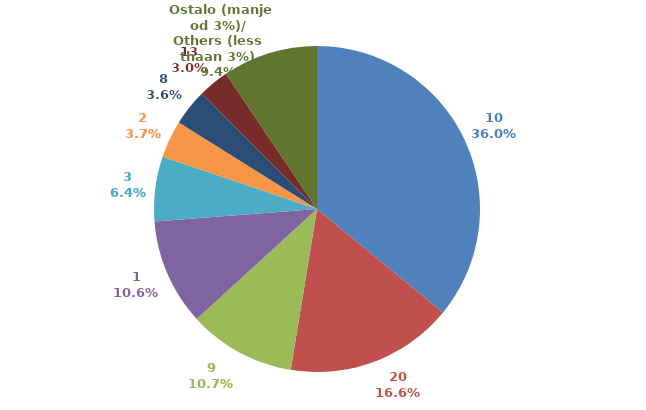
| Category | Series 0 |
|---|---|
| 10 | 26624543.64 |
| 20 | 12324193.68 |
| 9 | 7884278.13 |
| 1 | 7815423.73 |
| 3 | 4749616.3 |
| 2 | 2749799.45 |
| 8 | 2684307.81 |
| 13 | 2251593.54 |
|  Ostalo (manje od 3%)/
Others (less thaan 3%) | 6993532.47 |